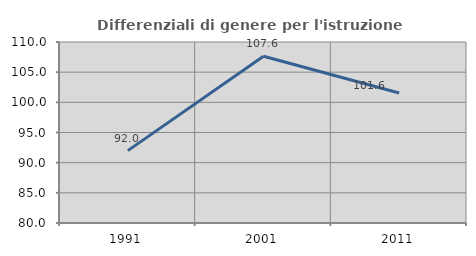
| Category | Differenziali di genere per l'istruzione superiore |
|---|---|
| 1991.0 | 91.999 |
| 2001.0 | 107.639 |
| 2011.0 | 101.554 |